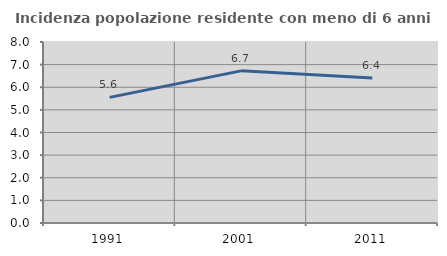
| Category | Incidenza popolazione residente con meno di 6 anni |
|---|---|
| 1991.0 | 5.553 |
| 2001.0 | 6.724 |
| 2011.0 | 6.406 |